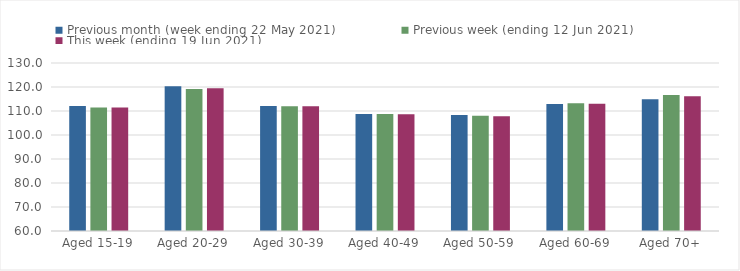
| Category | Previous month (week ending 22 May 2021) | Previous week (ending 12 Jun 2021) | This week (ending 19 Jun 2021) |
|---|---|---|---|
| Aged 15-19 | 112.09 | 111.42 | 111.48 |
| Aged 20-29 | 120.29 | 119.21 | 119.5 |
| Aged 30-39 | 112.11 | 111.97 | 111.94 |
| Aged 40-49 | 108.8 | 108.73 | 108.67 |
| Aged 50-59 | 108.32 | 108.07 | 107.81 |
| Aged 60-69 | 112.88 | 113.22 | 112.98 |
| Aged 70+ | 114.87 | 116.62 | 116.16 |